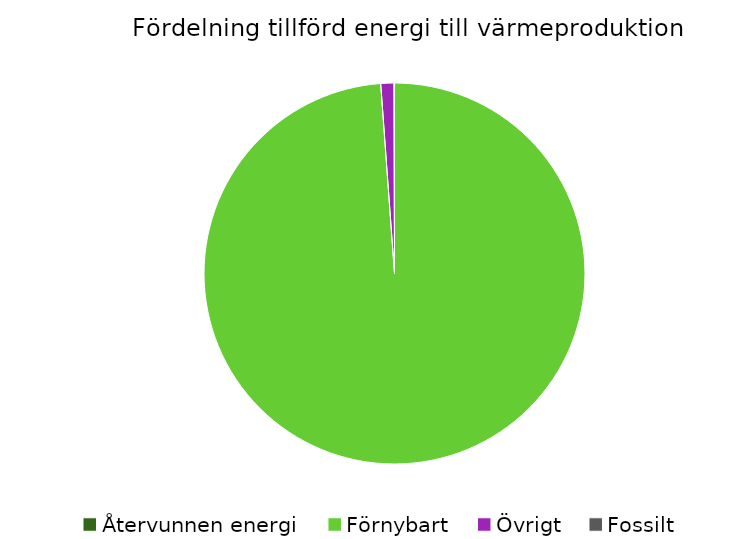
| Category | Fördelning värmeproduktion |
|---|---|
| Återvunnen energi | 0 |
| Förnybart | 0.988 |
| Övrigt | 0.011 |
| Fossilt | 0 |